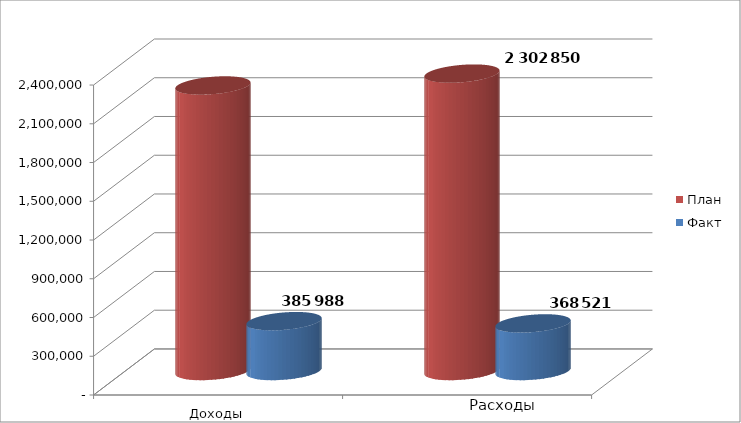
| Category | План | Факт |
|---|---|---|
| 0 | 2210870 | 385988 |
| 1 | 2302850 | 368521 |